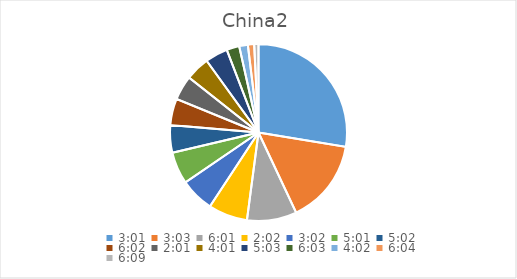
| Category | Series 0 |
|---|---|
| 0.12569444444444444 | 31.479 |
| 0.12708333333333333 | 17.576 |
| 0.25069444444444444 | 10.356 |
| 0.08472222222222221 | 8.174 |
| 0.12638888888888888 | 7.08 |
| 0.20902777777777778 | 6.681 |
| 0.20972222222222223 | 5.732 |
| 0.2513888888888889 | 5.525 |
| 0.08402777777777777 | 5.093 |
| 0.1673611111111111 | 5.002 |
| 0.21041666666666667 | 4.709 |
| 0.2520833333333333 | 2.656 |
| 0.16805555555555554 | 1.798 |
| 0.25277777777777777 | 1.311 |
| 0.25625000000000003 | 0.891 |